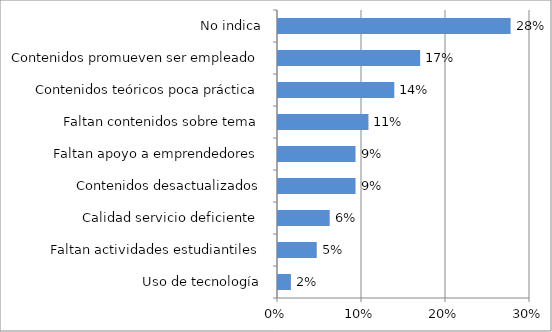
| Category | Series 2 |
|---|---|
| Uso de tecnología | 0.015 |
| Faltan actividades estudiantiles | 0.046 |
| Calidad servicio deficiente  | 0.062 |
| Contenidos desactualizados | 0.092 |
| Faltan apoyo a emprendedores | 0.092 |
| Faltan contenidos sobre tema | 0.108 |
| Contenidos teóricos poca práctica | 0.138 |
| Contenidos promueven ser empleado | 0.169 |
| No indica | 0.277 |